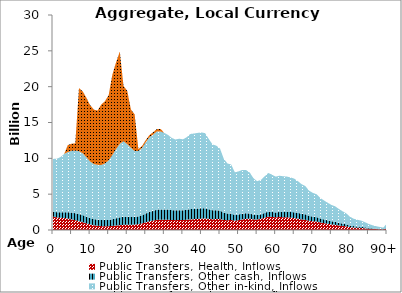
| Category | Public Transfers, Health, Inflows | Public Transfers, Other cash, Inflows | Public Transfers, Other in-kind, Inflows | Public Transfers, Education, Inflows |
|---|---|---|---|---|
| 0 | 1857.037 | 705.526 | 7358.105 | 0 |
|  | 1764.886 | 726.98 | 7446.911 | 0 |
| 2 | 1707.652 | 764.887 | 7699.685 | 0 |
| 3 | 1673.412 | 821.815 | 8106.138 | 0 |
| 4 | 1597.453 | 876.904 | 8401.377 | 974.209 |
| 5 | 1491.679 | 934.034 | 8622.95 | 995.445 |
| 6 | 1370.42 | 971.75 | 8732.324 | 1004.624 |
| 7 | 1238.455 | 993.298 | 8766.149 | 8811.02 |
| 8 | 1087.639 | 986.744 | 8622.581 | 8653.427 |
| 9 | 925.497 | 947.284 | 8278.848 | 8288.631 |
| 10 | 774.882 | 894.421 | 7893.351 | 7871.878 |
| 11 | 664.521 | 859.919 | 7668.866 | 7614.818 |
| 12 | 592.703 | 847.556 | 7650.334 | 7570.023 |
| 13 | 543.555 | 840.116 | 7684.232 | 8438.69 |
| 14 | 524.725 | 852.759 | 7912.209 | 8682.853 |
| 15 | 534.59 | 879.833 | 8294.991 | 9113.706 |
| 16 | 571.623 | 941.936 | 8953.998 | 11224.84 |
| 17 | 621.297 | 1016.261 | 9657.093 | 12112.109 |
| 18 | 675.678 | 1088.184 | 10259.615 | 12873.044 |
| 19 | 718.309 | 1137.096 | 10534.096 | 7728.005 |
| 20 | 722.899 | 1121.943 | 10136.207 | 7443.452 |
| 21 | 732.943 | 1094.377 | 9646.116 | 5342.84 |
| 22 | 755.301 | 1067.652 | 9198.413 | 5113.776 |
| 23 | 815.496 | 1084.094 | 9115.736 | 273.604 |
| 24 | 923.008 | 1138.11 | 9390.198 | 282.946 |
| 25 | 1078.531 | 1224.837 | 9939.883 | 300.5 |
| 26 | 1218.675 | 1305.928 | 10416.927 | 315.691 |
| 27 | 1319.454 | 1356.879 | 10649.802 | 323.493 |
| 28 | 1413.358 | 1413.202 | 10932.057 | 333.101 |
| 29 | 1446.297 | 1430.1 | 10875.267 | 332.277 |
| 30 | 1442.163 | 1431.592 | 10676.022 | 0 |
| 31 | 1427.411 | 1416.194 | 10427.579 | 0 |
| 32 | 1391.952 | 1383.357 | 10072.951 | 0 |
| 33 | 1376.579 | 1364.608 | 9886.963 | 0 |
| 34 | 1393.233 | 1376.905 | 9966.351 | 0 |
| 35 | 1386.315 | 1362.71 | 9902.669 | 0 |
| 36 | 1425.397 | 1387.314 | 10117.975 | 0 |
| 37 | 1489.723 | 1431.997 | 10476.706 | 0 |
| 38 | 1514.566 | 1436.239 | 10515.342 | 0 |
| 39 | 1547.335 | 1442.369 | 10560.91 | 0 |
| 40 | 1583.499 | 1447.432 | 10583.99 | 0 |
| 41 | 1606.306 | 1435.345 | 10474.278 | 0 |
| 42 | 1549.32 | 1342.239 | 9796.307 | 0 |
| 43 | 1504.435 | 1256.179 | 9175.116 | 0 |
| 44 | 1534.331 | 1231.502 | 9004.779 | 0 |
| 45 | 1537.71 | 1180.006 | 8655.937 | 0 |
| 46 | 1403.107 | 1021.636 | 7536.814 | 0 |
| 47 | 1364.364 | 939.75 | 6977.253 | 0 |
| 48 | 1402.121 | 914.583 | 6830.465 | 0 |
| 49 | 1292.222 | 791.816 | 5963.531 | 0 |
| 50 | 1377.353 | 791.217 | 6014.031 | 0 |
| 51 | 1480.475 | 797.655 | 6106.58 | 0 |
| 52 | 1553.43 | 784.787 | 6036.188 | 0 |
| 53 | 1570.032 | 740.047 | 5724.035 | 0 |
| 54 | 1486.542 | 656.715 | 5091.546 | 0 |
| 55 | 1466.379 | 611.201 | 4732.193 | 0 |
| 56 | 1559.336 | 623.174 | 4805.044 | 0 |
| 57 | 1714.596 | 664.121 | 5091.967 | 0 |
| 58 | 1860.3 | 709.507 | 5387.66 | 0 |
| 59 | 1827.273 | 694.18 | 5209.126 | 0 |
| 60 | 1775.085 | 674.018 | 4996.057 | 0 |
| 61 | 1813.737 | 702.117 | 5061.393 | 0 |
| 62 | 1790.394 | 721.833 | 4985.433 | 0 |
| 63 | 1771.306 | 754.498 | 4935.214 | 0 |
| 64 | 1729.238 | 784.045 | 4825.577 | 0 |
| 65 | 1670.367 | 814.196 | 4684.79 | 0 |
| 66 | 1578.245 | 808.603 | 4425.046 | 0 |
| 67 | 1480.095 | 779.728 | 4128.576 | 0 |
| 68 | 1425.123 | 760.361 | 3942.478 | 0 |
| 69 | 1284.837 | 685.319 | 3521.225 | 0 |
| 70 | 1224.388 | 643.882 | 3316.578 | 0 |
| 71 | 1182.983 | 618.355 | 3192.695 | 0 |
| 72 | 1058.007 | 556.235 | 2871.522 | 0 |
| 73 | 964.776 | 514.173 | 2655.486 | 0 |
| 74 | 874.226 | 477.085 | 2460.203 | 0 |
| 75 | 785.32 | 442.432 | 2278.87 | 0 |
| 76 | 727.339 | 420.315 | 2164.545 | 0 |
| 77 | 639.757 | 375.475 | 1935.89 | 0 |
| 78 | 564.274 | 333.31 | 1721.769 | 0 |
| 79 | 503.106 | 295.814 | 1535.636 | 0 |
| 80 | 403.44 | 234.425 | 1223.128 | 0 |
| 81 | 343.668 | 197.723 | 1036.439 | 0 |
| 82 | 313.288 | 178.319 | 939.21 | 0 |
| 83 | 290.687 | 163.524 | 865.835 | 0 |
| 84 | 245.47 | 135.869 | 722.982 | 0 |
| 85 | 194.018 | 105.164 | 563.467 | 0 |
| 86 | 155.375 | 81.18 | 440.491 | 0 |
| 87 | 127.538 | 63.974 | 352.409 | 0 |
| 88 | 103.094 | 49.641 | 277.98 | 0 |
| 89 | 80.998 | 37.262 | 212.726 | 0 |
| 90+ | 231.034 | 101.324 | 590.581 | 0 |